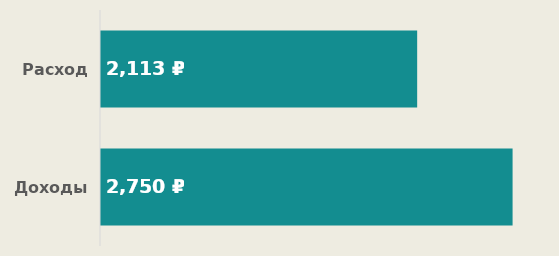
| Category | Доходы |
|---|---|
| Доходы | 2750 |
| Расходы | 2112.5 |